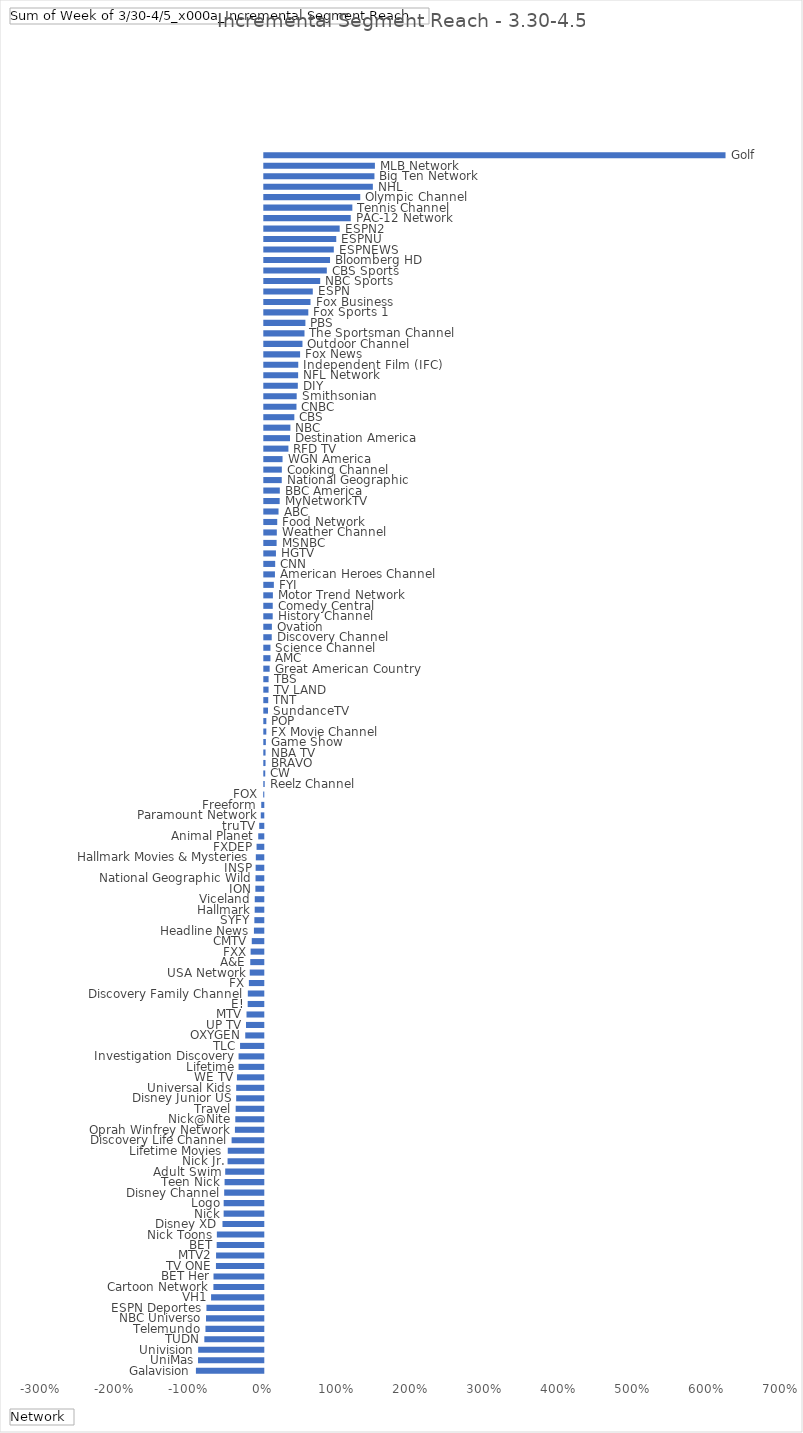
| Category | Total |
|---|---|
| Galavision | -0.909 |
| UniMas | -0.881 |
| Univision | -0.879 |
| TUDN | -0.796 |
| Telemundo | -0.781 |
| NBC Universo | -0.773 |
| ESPN Deportes | -0.767 |
| VH1 | -0.705 |
| Cartoon Network | -0.673 |
| BET Her | -0.672 |
| TV ONE | -0.639 |
| MTV2 | -0.638 |
| BET | -0.629 |
| Nick Toons | -0.627 |
| Disney XD | -0.551 |
| Nick | -0.535 |
| Logo | -0.535 |
| Disney Channel | -0.528 |
| Teen Nick | -0.522 |
| Adult Swim | -0.514 |
| Nick Jr. | -0.482 |
| Lifetime Movies | -0.48 |
| Discovery Life Channel | -0.428 |
| Oprah Winfrey Network | -0.383 |
| Nick@Nite | -0.378 |
| Travel | -0.373 |
| Disney Junior US | -0.366 |
| Universal Kids | -0.366 |
| WE TV | -0.356 |
| Lifetime | -0.334 |
| Investigation Discovery | -0.334 |
| TLC | -0.314 |
| OXYGEN | -0.244 |
| UP TV | -0.234 |
| MTV | -0.227 |
| E! | -0.211 |
| Discovery Family Channel | -0.209 |
| FX | -0.195 |
| USA Network | -0.183 |
| A&E | -0.176 |
| FXX | -0.171 |
| CMTV | -0.156 |
| Headline News | -0.127 |
| SYFY | -0.121 |
| Hallmark | -0.116 |
| Viceland | -0.115 |
| ION | -0.107 |
| National Geographic Wild | -0.105 |
| INSP | -0.104 |
| Hallmark Movies & Mysteries | -0.101 |
| FXDEP | -0.091 |
| Animal Planet | -0.068 |
| truTV | -0.055 |
| Paramount Network | -0.034 |
| Freeform | -0.028 |
| FOX | -0.001 |
| Reelz Channel | 0.005 |
| CW | 0.013 |
| BRAVO | 0.017 |
| NBA TV | 0.017 |
| Game Show | 0.021 |
| FX Movie Channel | 0.027 |
| POP | 0.028 |
| SundanceTV | 0.05 |
| TNT | 0.053 |
| TV LAND | 0.058 |
| TBS | 0.058 |
| Great American Country | 0.072 |
| AMC | 0.083 |
| Science Channel | 0.083 |
| Discovery Channel | 0.1 |
| Ovation | 0.102 |
| History Channel | 0.113 |
| Comedy Central | 0.114 |
| Motor Trend Network | 0.116 |
| FYI | 0.129 |
| American Heroes Channel | 0.144 |
| CNN | 0.147 |
| HGTV | 0.157 |
| MSNBC | 0.166 |
| Weather Channel | 0.169 |
| Food Network | 0.174 |
| ABC | 0.192 |
| MyNetworkTV | 0.208 |
| BBC America | 0.209 |
| National Geographic | 0.236 |
| Cooking Channel | 0.237 |
| WGN America | 0.246 |
| RFD TV | 0.325 |
| Destination America | 0.347 |
| NBC | 0.352 |
| CBS | 0.405 |
| CNBC | 0.434 |
| Smithsonian | 0.437 |
| DIY | 0.452 |
| NFL Network | 0.457 |
| Independent Film (IFC) | 0.458 |
| Fox News | 0.483 |
| Outdoor Channel | 0.515 |
| The Sportsman Channel | 0.542 |
| PBS | 0.555 |
| Fox Sports 1 | 0.594 |
| Fox Business | 0.623 |
| ESPN | 0.654 |
| NBC Sports | 0.754 |
| CBS Sports | 0.844 |
| Bloomberg HD | 0.887 |
| ESPNEWS | 0.938 |
| ESPNU | 0.971 |
| ESPN2 | 1.017 |
| PAC-12 Network | 1.166 |
| Tennis Channel | 1.188 |
| Olympic Channel | 1.295 |
| NHL | 1.465 |
| Big Ten Network | 1.486 |
| MLB Network | 1.493 |
| Golf | 6.224 |